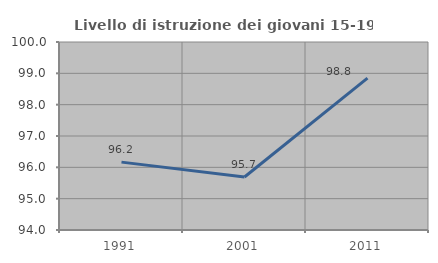
| Category | Livello di istruzione dei giovani 15-19 anni |
|---|---|
| 1991.0 | 96.166 |
| 2001.0 | 95.692 |
| 2011.0 | 98.846 |